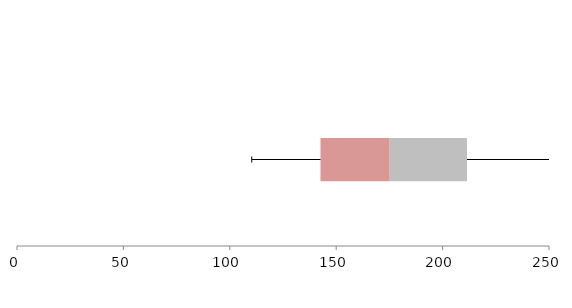
| Category | Series 1 | Series 2 | Series 3 |
|---|---|---|---|
| 0 | 142.615 | 32.529 | 36.32 |